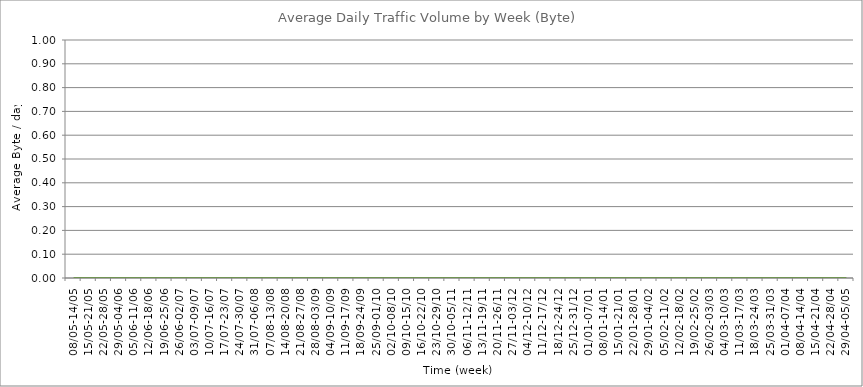
| Category | Average |
|---|---|
| 08/05-14/05 | 0 |
| 15/05-21/05 | 0 |
| 22/05-28/05 | 0 |
| 29/05-04/06 | 0 |
| 05/06-11/06 | 0 |
| 12/06-18/06 | 0 |
| 19/06-25/06 | 0 |
| 26/06-02/07 | 0 |
| 03/07-09/07 | 0 |
| 10/07-16/07 | 0 |
| 17/07-23/07 | 0 |
| 24/07-30/07 | 0 |
| 31/07-06/08 | 0 |
| 07/08-13/08 | 0 |
| 14/08-20/08 | 0 |
| 21/08-27/08 | 0 |
| 28/08-03/09 | 0 |
| 04/09-10/09 | 0 |
| 11/09-17/09 | 0 |
| 18/09-24/09 | 0 |
| 25/09-01/10 | 0 |
| 02/10-08/10 | 0 |
| 09/10-15/10 | 0 |
| 16/10-22/10 | 0 |
| 23/10-29/10 | 0 |
| 30/10-05/11 | 0 |
| 06/11-12/11 | 0 |
| 13/11-19/11 | 0 |
| 20/11-26/11 | 0 |
| 27/11-03/12 | 0 |
| 04/12-10/12 | 0 |
| 11/12-17/12 | 0 |
| 18/12-24/12 | 0 |
| 25/12-31/12 | 0 |
| 01/01-07/01 | 0 |
| 08/01-14/01 | 0 |
| 15/01-21/01 | 0 |
| 22/01-28/01 | 0 |
| 29/01-04/02 | 0 |
| 05/02-11/02 | 0 |
| 12/02-18/02 | 0 |
| 19/02-25/02 | 0 |
| 26/02-03/03 | 0 |
| 04/03-10/03 | 0 |
| 11/03-17/03 | 0 |
| 18/03-24/03 | 0 |
| 25/03-31/03 | 0 |
| 01/04-07/04 | 0 |
| 08/04-14/04 | 0 |
| 15/04-21/04 | 0 |
| 22/04-28/04 | 0 |
| 29/04-05/05 | 0 |